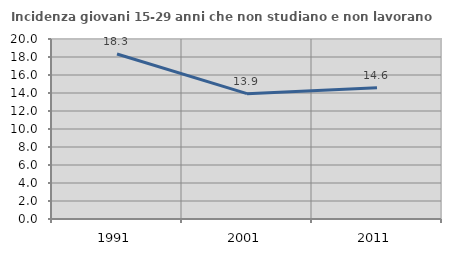
| Category | Incidenza giovani 15-29 anni che non studiano e non lavorano  |
|---|---|
| 1991.0 | 18.333 |
| 2001.0 | 13.924 |
| 2011.0 | 14.596 |